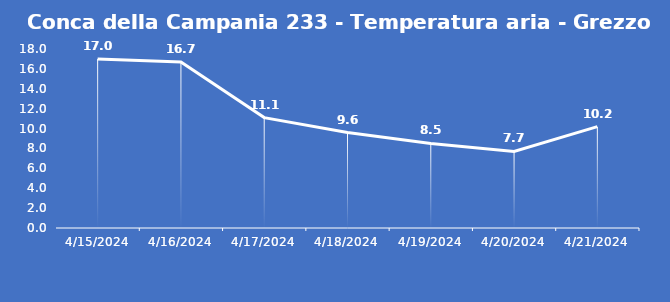
| Category | Conca della Campania 233 - Temperatura aria - Grezzo (°C) |
|---|---|
| 4/15/24 | 17 |
| 4/16/24 | 16.7 |
| 4/17/24 | 11.1 |
| 4/18/24 | 9.6 |
| 4/19/24 | 8.5 |
| 4/20/24 | 7.7 |
| 4/21/24 | 10.2 |